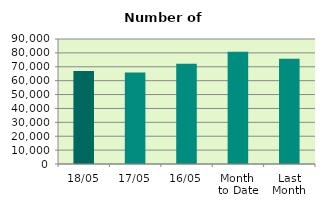
| Category | Series 0 |
|---|---|
| 18/05 | 67022 |
| 17/05 | 65970 |
| 16/05 | 72196 |
| Month 
to Date | 80829 |
| Last
Month | 75814.526 |